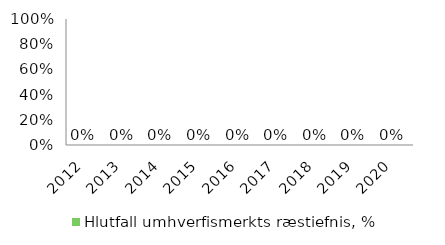
| Category | Hlutfall umhverfismerkts ræstiefnis, % |
|---|---|
| 2012.0 | 0 |
| 2013.0 | 0 |
| 2014.0 | 0 |
| 2015.0 | 0 |
| 2016.0 | 0 |
| 2017.0 | 0 |
| 2018.0 | 0 |
| 2019.0 | 0 |
| 2020.0 | 0 |